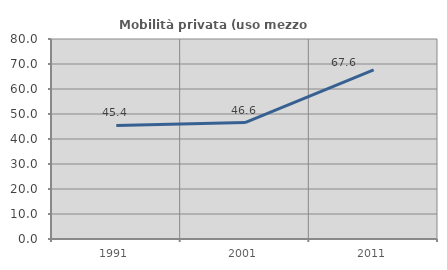
| Category | Mobilità privata (uso mezzo privato) |
|---|---|
| 1991.0 | 45.433 |
| 2001.0 | 46.562 |
| 2011.0 | 67.63 |